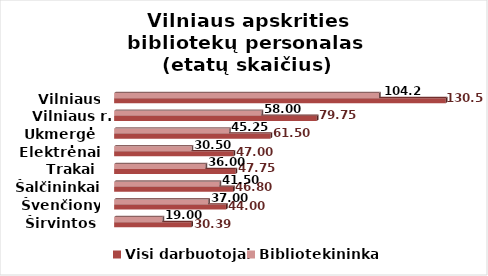
| Category | Visi darbuotojai | Bibliotekininkai |
|---|---|---|
| Širvintos | 30.39 | 19 |
| Švenčionys | 44 | 37 |
| Šalčininkai | 46.8 | 41.5 |
| Trakai | 47.75 | 36 |
| Elektrėnai | 47 | 30.5 |
| Ukmergė | 61.5 | 45.25 |
| Vilniaus r. | 79.75 | 58 |
| Vilniaus m. | 130.5 | 104.25 |